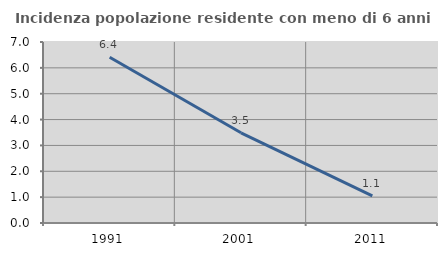
| Category | Incidenza popolazione residente con meno di 6 anni |
|---|---|
| 1991.0 | 6.41 |
| 2001.0 | 3.488 |
| 2011.0 | 1.053 |